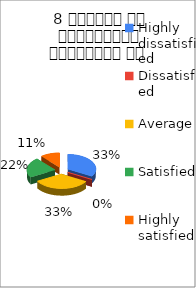
| Category | 8 शिक्षक का सम्प्रेषण सुस्पष्ठ है  |
|---|---|
| Highly dissatisfied | 3 |
| Dissatisfied | 0 |
| Average | 3 |
| Satisfied | 2 |
| Highly satisfied | 1 |